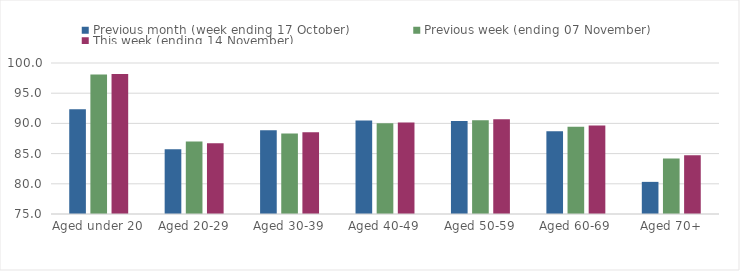
| Category | Previous month (week ending 17 October) | Previous week (ending 07 November) | This week (ending 14 November) |
|---|---|---|---|
| Aged under 20 | 92.33 | 98.11 | 98.16 |
| Aged 20-29 | 85.7 | 86.99 | 86.73 |
| Aged 30-39 | 88.87 | 88.33 | 88.55 |
| Aged 40-49 | 90.5 | 90.03 | 90.14 |
| Aged 50-59 | 90.39 | 90.54 | 90.7 |
| Aged 60-69 | 88.7 | 89.46 | 89.66 |
| Aged 70+ | 80.32 | 84.17 | 84.71 |